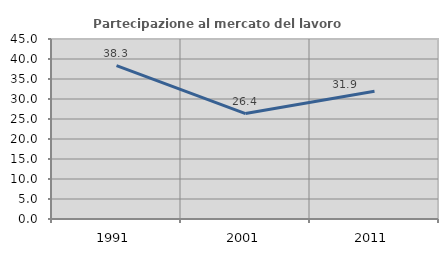
| Category | Partecipazione al mercato del lavoro  femminile |
|---|---|
| 1991.0 | 38.344 |
| 2001.0 | 26.351 |
| 2011.0 | 31.918 |